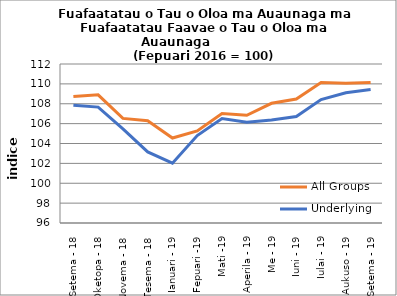
| Category | All Groups | Underlying |
|---|---|---|
| Setema - 18 | 108.722 | 107.857 |
| Oketopa - 18 | 108.895 | 107.664 |
| Novema - 18 | 106.524 | 105.471 |
| Tesema - 18 | 106.292 | 103.148 |
| Ianuari - 19 | 104.55 | 102.019 |
| Fepuari -19 | 105.272 | 104.794 |
| Mati -19 | 107.012 | 106.51 |
| Aperila - 19 | 106.842 | 106.143 |
| Me - 19 | 108.044 | 106.37 |
| Iuni - 19 | 108.473 | 106.721 |
| Iulai - 19 | 110.146 | 108.423 |
| Aukuso - 19 | 110.057 | 109.11 |
| Setema - 19 | 110.148 | 109.423 |